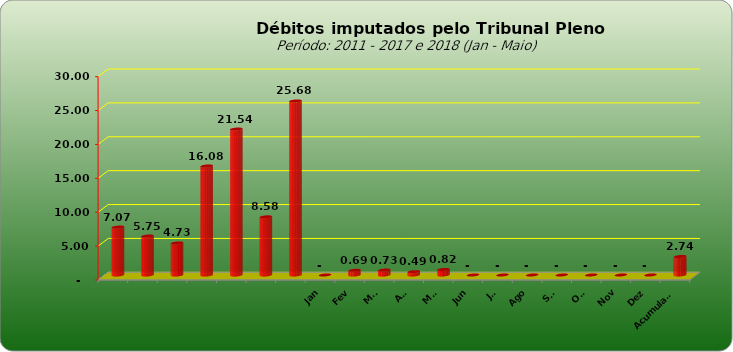
| Category |  7.073.154,74  |
|---|---|
|  | 7073154.74 |
|  | 5749129.25 |
|  | 4727033.51 |
|  | 16081820.48 |
|  | 21535723.6 |
|  | 8578266.09 |
|  | 25676499.17 |
| Jan | 0 |
| Fev | 689867.86 |
| Mar | 729624.1 |
| Abr | 491509.68 |
| Mai | 824303.32 |
| Jun | 0 |
| Jul | 0 |
| Ago | 0 |
| Set | 0 |
| Out | 0 |
| Nov | 0 |
| Dez | 0 |
| Acumulado | 2735304.96 |